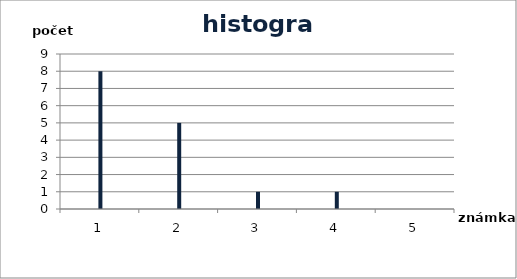
| Category | p.ž |
|---|---|
| 0 | 8 |
| 1 | 5 |
| 2 | 1 |
| 3 | 1 |
| 4 | 0 |